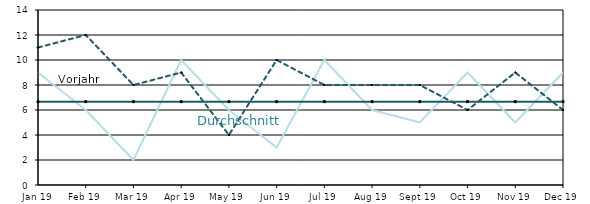
| Category | Berichtsjahr | Durchschnitt | Vorjahr |
|---|---|---|---|
| 2019-01-01 | 9 | 6.667 | 11 |
| 2019-02-01 | 6 | 6.667 | 12 |
| 2019-03-01 | 2 | 6.667 | 8 |
| 2019-04-01 | 10 | 6.667 | 9 |
| 2019-05-01 | 6 | 6.667 | 4 |
| 2019-06-01 | 3 | 6.667 | 10 |
| 2019-07-01 | 10 | 6.667 | 8 |
| 2019-08-01 | 6 | 6.667 | 8 |
| 2019-09-01 | 5 | 6.667 | 8 |
| 2019-10-01 | 9 | 6.667 | 6 |
| 2019-11-01 | 5 | 6.667 | 9 |
| 2019-12-01 | 9 | 6.667 | 6 |